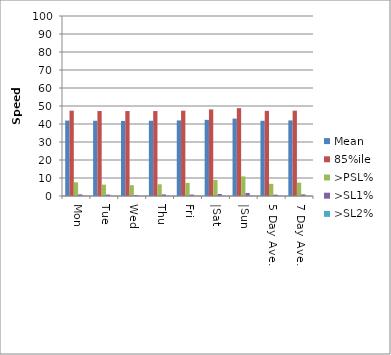
| Category | Mean | 85%ile | >PSL% | >SL1% | >SL2% |
|---|---|---|---|---|---|
| Mon | 41.9 | 47.4 | 7.6 | 0.9 | 0.1 |
| Tue | 41.8 | 47.2 | 6.3 | 0.8 | 0.1 |
| Wed | 41.7 | 47.2 | 6 | 0.5 | 0 |
| Thu | 41.8 | 47.2 | 6.5 | 0.9 | 0.1 |
| Fri | 42 | 47.4 | 7.3 | 0.8 | 0.1 |
| |Sat | 42.3 | 48.1 | 8.9 | 1.1 | 0.1 |
| |Sun | 43 | 48.8 | 10.9 | 1.7 | 0.2 |
| 5 Day Ave. | 41.8 | 47.3 | 6.761 | 0.753 | 0.078 |
| 7 Day Ave. | 42 | 47.4 | 7.4 | 0.9 | 0.1 |